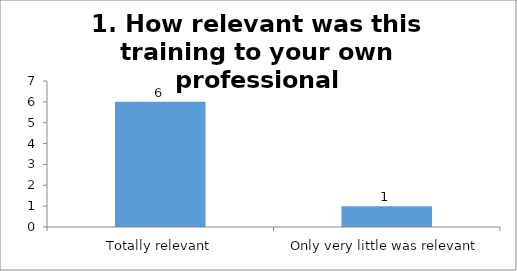
| Category | 1. How relevant was this training to your own professional development? |
|---|---|
| Totally relevant | 6 |
| Only very little was relevant | 1 |